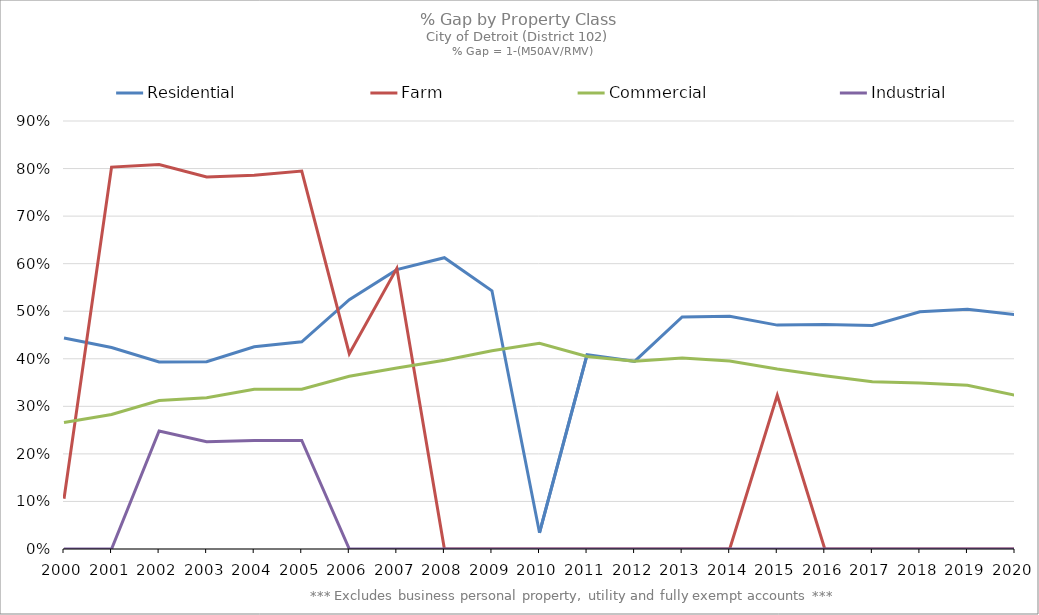
| Category | Residential | Farm | Commercial | Industrial |
|---|---|---|---|---|
| 2000.0 | 0.444 | 0.106 | 0.266 | 0 |
| 2001.0 | 0.424 | 0.803 | 0.283 | 0 |
| 2002.0 | 0.393 | 0.809 | 0.312 | 0.248 |
| 2003.0 | 0.394 | 0.783 | 0.318 | 0.226 |
| 2004.0 | 0.425 | 0.786 | 0.336 | 0.228 |
| 2005.0 | 0.436 | 0.795 | 0.336 | 0.228 |
| 2006.0 | 0.524 | 0.411 | 0.363 | 0 |
| 2007.0 | 0.587 | 0.59 | 0.381 | 0 |
| 2008.0 | 0.613 | 0 | 0.397 | 0 |
| 2009.0 | 0.543 | 0 | 0.417 | 0 |
| 2010.0 | 0.034 | 0 | 0.432 | 0 |
| 2011.0 | 0.408 | 0 | 0.405 | 0 |
| 2012.0 | 0.395 | 0 | 0.395 | 0 |
| 2013.0 | 0.488 | 0 | 0.402 | 0 |
| 2014.0 | 0.489 | 0 | 0.395 | 0 |
| 2015.0 | 0.471 | 0.323 | 0.379 | 0 |
| 2016.0 | 0.472 | 0 | 0.364 | 0 |
| 2017.0 | 0.47 | 0 | 0.352 | 0 |
| 2018.0 | 0.499 | 0 | 0.349 | 0 |
| 2019.0 | 0.504 | 0 | 0.344 | 0 |
| 2020.0 | 0.493 | 0 | 0.323 | 0 |